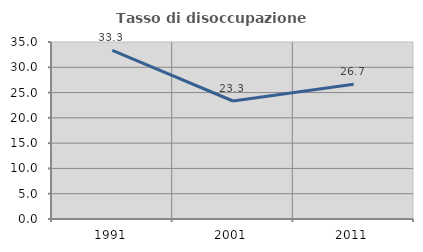
| Category | Tasso di disoccupazione giovanile  |
|---|---|
| 1991.0 | 33.333 |
| 2001.0 | 23.333 |
| 2011.0 | 26.667 |